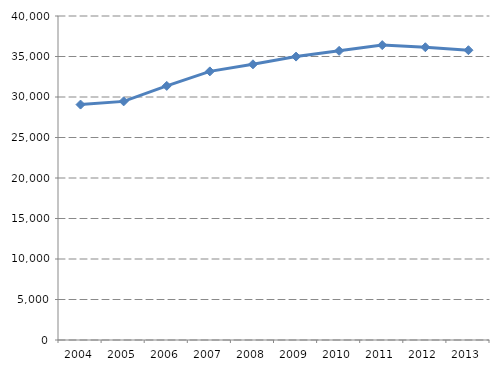
| Category | Dépenses par bénéficiaire |
|---|---|
| 2004.0 | 29065.585 |
| 2005.0 | 29460.007 |
| 2006.0 | 31371.111 |
| 2007.0 | 33163.171 |
| 2008.0 | 34035.801 |
| 2009.0 | 34990.262 |
| 2010.0 | 35697.373 |
| 2011.0 | 36405.73 |
| 2012.0 | 36143.246 |
| 2013.0 | 35777.341 |